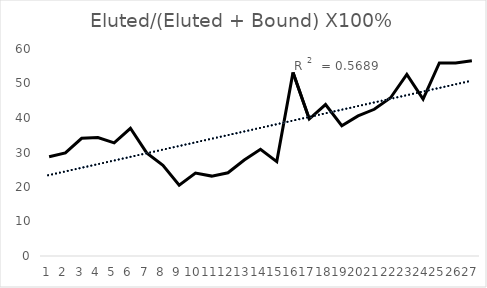
| Category | Series 0 |
|---|---|
| 0 | 28.76 |
| 1 | 29.88 |
| 2 | 34.12 |
| 3 | 34.32 |
| 4 | 32.8 |
| 5 | 37.02 |
| 6 | 29.87 |
| 7 | 26.27 |
| 8 | 20.52 |
| 9 | 24.04 |
| 10 | 23.16 |
| 11 | 24.13 |
| 12 | 27.83 |
| 13 | 30.93 |
| 14 | 27.37 |
| 15 | 53.22 |
| 16 | 39.71 |
| 17 | 43.91 |
| 18 | 37.75 |
| 19 | 40.61 |
| 20 | 42.53 |
| 21 | 45.86 |
| 22 | 52.62 |
| 23 | 45.49 |
| 24 | 55.94 |
| 25 | 55.97 |
| 26 | 56.61 |